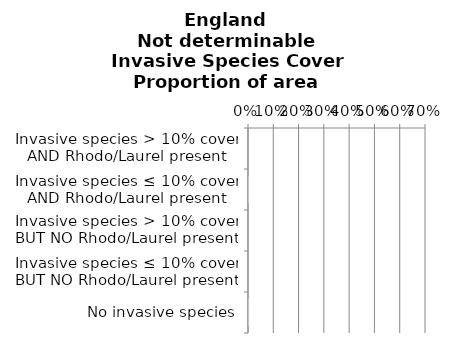
| Category | Not determinable |
|---|---|
| No invasive species | 0.001 |
| Invasive species ≤ 10% cover BUT NO Rhodo/Laurel present | 0 |
| Invasive species > 10% cover BUT NO Rhodo/Laurel present | 0 |
| Invasive species ≤ 10% cover AND Rhodo/Laurel present | 0 |
| Invasive species > 10% cover AND Rhodo/Laurel present | 0 |